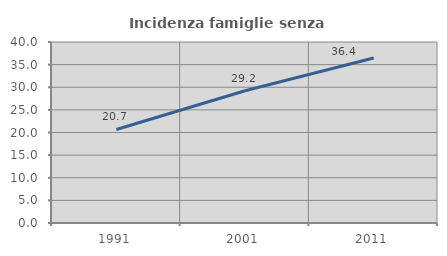
| Category | Incidenza famiglie senza nuclei |
|---|---|
| 1991.0 | 20.664 |
| 2001.0 | 29.223 |
| 2011.0 | 36.449 |